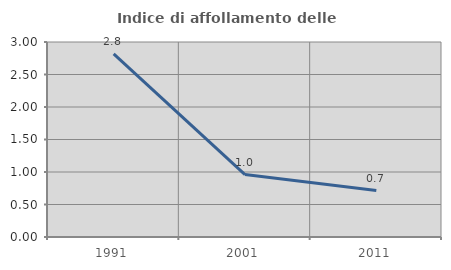
| Category | Indice di affollamento delle abitazioni  |
|---|---|
| 1991.0 | 2.818 |
| 2001.0 | 0.96 |
| 2011.0 | 0.714 |